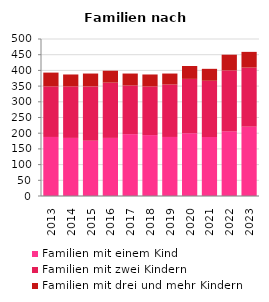
| Category | Familien mit einem Kind | Familien mit zwei Kindern | Familien mit drei und mehr Kindern |
|---|---|---|---|
| 2013.0 | 188 | 161 | 44 |
| 2014.0 | 185 | 164 | 38 |
| 2015.0 | 176 | 173 | 41 |
| 2016.0 | 185 | 176 | 38 |
| 2017.0 | 197 | 155 | 38 |
| 2018.0 | 194 | 155 | 38 |
| 2019.0 | 188 | 167 | 35 |
| 2020.0 | 200 | 173 | 41 |
| 2021.0 | 188 | 179 | 38 |
| 2022.0 | 206 | 194 | 50 |
| 2023.0 | 221 | 188 | 50 |